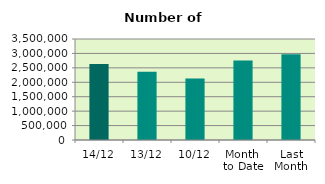
| Category | Series 0 |
|---|---|
| 14/12 | 2633682 |
| 13/12 | 2363756 |
| 10/12 | 2131012 |
| Month 
to Date | 2757252.6 |
| Last
Month | 2974168.364 |